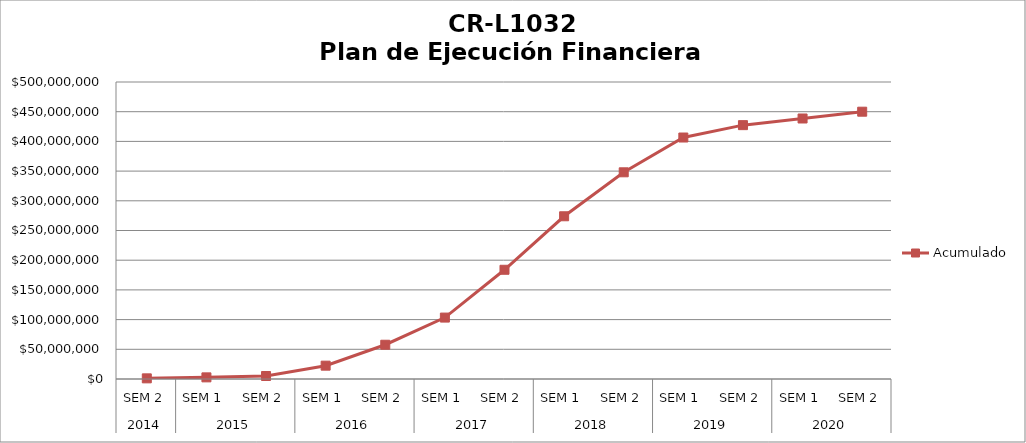
| Category | Acumulado |
|---|---|
| 0 | 1084711.538 |
| 1 | 2752767.692 |
| 2 | 5024893.846 |
| 3 | 22442775.639 |
| 4 | 57684109.237 |
| 5 | 103397183.518 |
| 6 | 183870941.857 |
| 7 | 273954372.62 |
| 8 | 347960773.361 |
| 9 | 406529558.982 |
| 10 | 427365664.106 |
| 11 | 438568485.899 |
| 12 | 450000000 |